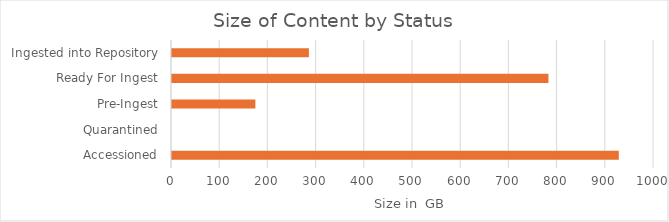
| Category | Size in GB |
|---|---|
| Accessioned | 927 |
| Quarantined | 0 |
| Pre-Ingest | 173 |
| Ready For Ingest | 781 |
| Ingested into Repository | 284 |